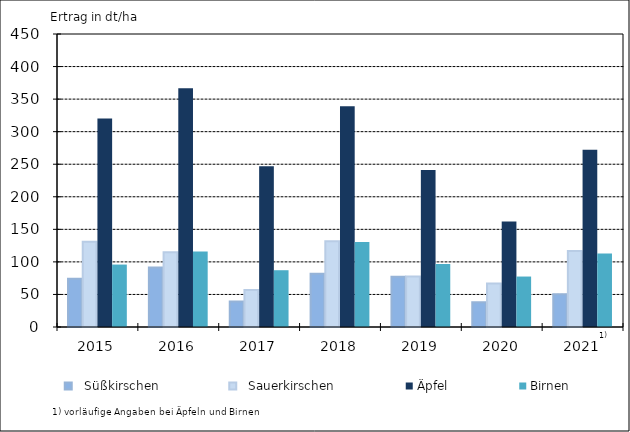
| Category |   Süßkirschen |   Sauerkirschen | Äpfel | Birnen |
|---|---|---|---|---|
| 2015.0 | 74.2 | 130.8 | 320.2 | 95.9 |
| 2016.0 | 91.2 | 114.7 | 366.7 | 116 |
| 2017.0 | 39.1 | 56.7 | 246.9 | 87.2 |
| 2018.0 | 81.9 | 131.6 | 339.1 | 130.7 |
| 2019.0 | 77.2 | 77.7 | 241.3 | 96.8 |
| 2020.0 | 38 | 66.9 | 161.9 | 77.5 |
| 2021.0 | 50.2 | 116.8 | 272.1 | 113 |